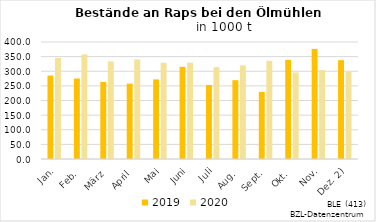
| Category | 2019 | 2020 |
|---|---|---|
| Jan. | 285.243 | 345.555 |
| Feb. | 275.267 | 357.666 |
| März | 263.235 | 333.585 |
| April | 257.584 | 340.405 |
| Mai | 272.142 | 328.917 |
| Juni | 315.109 | 329.685 |
| Juli | 252.713 | 313.99 |
| Aug. | 269.422 | 320.006 |
| Sept. | 229.272 | 335.618 |
| Okt. | 338.664 | 296.037 |
| Nov. | 376.436 | 303.897 |
| Dez. 2) | 337.963 | 297.304 |